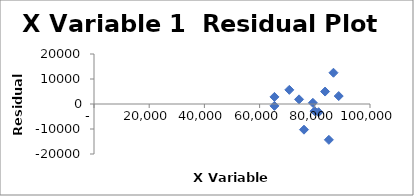
| Category | Series 0 |
|---|---|
| 88663.92768553032 | 3179.001 |
| 74298.2593442623 | 1862.122 |
| 83725.86871779327 | 4978.237 |
| 70766.54529497806 | 5661.135 |
| 79930.4587358378 | -2855.446 |
| 86769.84939563231 | 12503.956 |
| 76078.06578483245 | -10273.226 |
| 79298.28912537413 | 474.834 |
| 81365.00832282472 | -3281.13 |
| 65375.5544110148 | -755.657 |
| 85095.67340684288 | -14334.44 |
| 65377.609711846315 | 2840.615 |